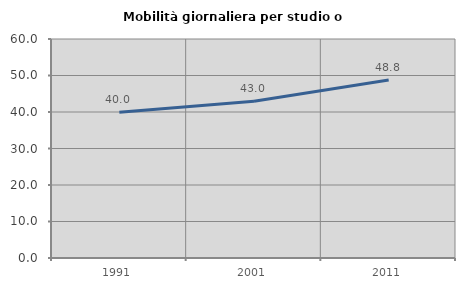
| Category | Mobilità giornaliera per studio o lavoro |
|---|---|
| 1991.0 | 39.959 |
| 2001.0 | 42.969 |
| 2011.0 | 48.78 |